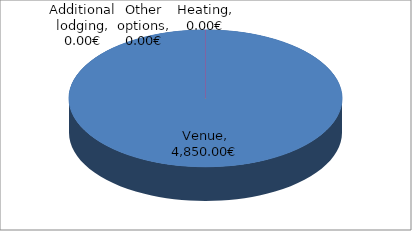
| Category | 4,850.00€ 0.00€ 0.00€ 0.00€ |
|---|---|
| Venue | 4850 |
| Heating | 0 |
| Additional lodging | 0 |
| Other options | 0 |